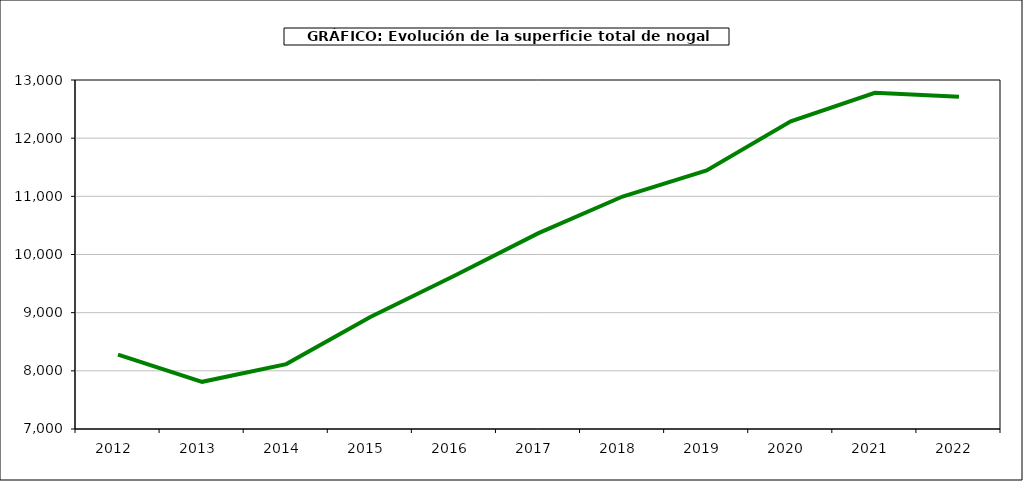
| Category | superficie nogal |
|---|---|
| 2012.0 | 8278 |
| 2013.0 | 7811 |
| 2014.0 | 8116 |
| 2015.0 | 8926 |
| 2016.0 | 9634 |
| 2017.0 | 10367 |
| 2018.0 | 10997 |
| 2019.0 | 11444 |
| 2020.0 | 12290 |
| 2021.0 | 12781 |
| 2022.0 | 12713 |